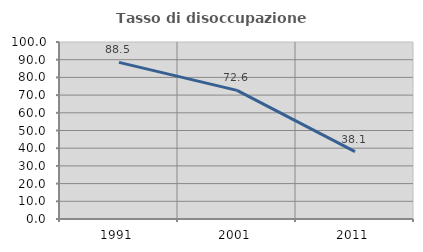
| Category | Tasso di disoccupazione giovanile  |
|---|---|
| 1991.0 | 88.511 |
| 2001.0 | 72.65 |
| 2011.0 | 38.095 |